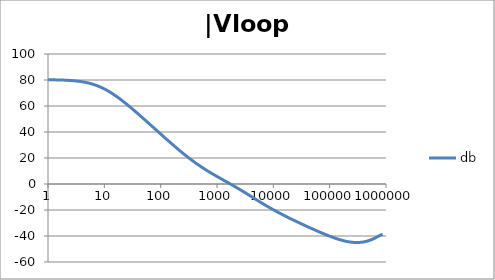
| Category | db |
|---|---|
| 1.0 | 80.192 |
| 1.0715193052376064 | 80.176 |
| 1.1481536214968828 | 80.157 |
| 1.2302687708123814 | 80.135 |
| 1.318256738556407 | 80.11 |
| 1.4125375446227544 | 80.081 |
| 1.513561248436208 | 80.049 |
| 1.6218100973589298 | 80.011 |
| 1.7378008287493754 | 79.969 |
| 1.8620871366628673 | 79.92 |
| 1.9952623149688797 | 79.864 |
| 2.1379620895022318 | 79.801 |
| 2.2908676527677727 | 79.729 |
| 2.45470891568503 | 79.647 |
| 2.6302679918953817 | 79.553 |
| 2.8183829312644537 | 79.448 |
| 3.0199517204020156 | 79.328 |
| 3.235936569296282 | 79.193 |
| 3.467368504525316 | 79.04 |
| 3.7153522909717256 | 78.868 |
| 3.9810717055349727 | 78.675 |
| 4.265795188015926 | 78.459 |
| 4.570881896148749 | 78.218 |
| 4.897788193684462 | 77.95 |
| 5.2480746024977245 | 77.652 |
| 5.62341325190349 | 77.322 |
| 6.025595860743575 | 76.96 |
| 6.456542290346554 | 76.562 |
| 6.918309709189363 | 76.127 |
| 7.4131024130091765 | 75.654 |
| 7.943282347242814 | 75.142 |
| 8.511380382023765 | 74.59 |
| 9.120108393559095 | 73.998 |
| 9.772372209558105 | 73.365 |
| 10.47128548050899 | 72.692 |
| 11.22018454301963 | 71.98 |
| 12.022644346174127 | 71.229 |
| 12.88249551693134 | 70.44 |
| 13.803842646028851 | 69.616 |
| 14.791083881682074 | 68.758 |
| 15.848931924611136 | 67.868 |
| 16.98243652461744 | 66.948 |
| 18.197008586099834 | 66 |
| 19.498445997580447 | 65.026 |
| 20.892961308540382 | 64.028 |
| 22.387211385683386 | 63.009 |
| 23.988329190194897 | 61.97 |
| 25.703957827688622 | 60.913 |
| 27.54228703338165 | 59.841 |
| 29.51209226666385 | 58.754 |
| 31.62277660168379 | 57.654 |
| 33.884415613920254 | 56.543 |
| 36.307805477010106 | 55.422 |
| 38.90451449942804 | 54.293 |
| 41.686938347033525 | 53.156 |
| 44.6683592150963 | 52.013 |
| 47.86300923226381 | 50.864 |
| 51.28613839913647 | 49.71 |
| 54.95408738576247 | 48.553 |
| 58.88436553555889 | 47.392 |
| 63.09573444801931 | 46.229 |
| 67.60829753919813 | 45.065 |
| 72.44359600749901 | 43.899 |
| 77.62471166286915 | 42.733 |
| 83.17637711026705 | 41.566 |
| 89.12509381337456 | 40.401 |
| 95.49925860214357 | 39.237 |
| 102.32929922807544 | 38.075 |
| 109.64781961431841 | 36.915 |
| 117.48975549395293 | 35.758 |
| 125.89254117941665 | 34.606 |
| 134.89628825916537 | 33.458 |
| 144.54397707459273 | 32.316 |
| 154.88166189124806 | 31.18 |
| 165.95869074375608 | 30.051 |
| 177.82794100389225 | 28.93 |
| 190.5460717963248 | 27.819 |
| 204.17379446695278 | 26.718 |
| 218.77616239495524 | 25.628 |
| 234.42288153199212 | 24.55 |
| 251.18864315095806 | 23.486 |
| 269.15348039269156 | 22.436 |
| 288.4031503126605 | 21.402 |
| 309.0295432513591 | 20.385 |
| 331.1311214825911 | 19.384 |
| 354.81338923357566 | 18.402 |
| 380.18939632056095 | 17.439 |
| 407.3802778041123 | 16.495 |
| 436.5158322401654 | 15.57 |
| 467.7351412871979 | 14.665 |
| 501.18723362727184 | 13.779 |
| 537.0317963702526 | 12.911 |
| 575.4399373371566 | 12.062 |
| 616.5950018614822 | 11.231 |
| 660.6934480075952 | 10.416 |
| 707.9457843841375 | 9.616 |
| 758.5775750291831 | 8.829 |
| 812.8305161640983 | 8.056 |
| 870.9635899560801 | 7.294 |
| 933.2543007969903 | 6.541 |
| 999.9999999999998 | 5.796 |
| 1071.5193052376057 | 5.057 |
| 1148.1536214968828 | 4.323 |
| 1230.2687708123801 | 3.593 |
| 1318.2567385564053 | 2.864 |
| 1412.537544622753 | 2.135 |
| 1513.5612484362066 | 1.405 |
| 1621.8100973589292 | 0.673 |
| 1737.8008287493742 | -0.064 |
| 1862.0871366628671 | -0.805 |
| 1995.2623149688786 | -1.552 |
| 2137.9620895022326 | -2.305 |
| 2290.867652767771 | -3.066 |
| 2454.708915685027 | -3.834 |
| 2630.26799189538 | -4.61 |
| 2818.382931264451 | -5.394 |
| 3019.9517204020176 | -6.184 |
| 3235.9365692962774 | -6.982 |
| 3467.368504525316 | -7.784 |
| 3715.352290971724 | -8.592 |
| 3981.07170553497 | -9.402 |
| 4265.795188015923 | -10.214 |
| 4570.881896148745 | -11.027 |
| 4897.788193684463 | -11.837 |
| 5248.074602497726 | -12.645 |
| 5623.413251903489 | -13.448 |
| 6025.595860743574 | -14.245 |
| 6456.54229034655 | -15.034 |
| 6918.309709189357 | -15.815 |
| 7413.102413009165 | -16.587 |
| 7943.282347242815 | -17.349 |
| 8511.380382023763 | -18.1 |
| 9120.108393559092 | -18.84 |
| 9772.3722095581 | -19.569 |
| 10471.285480509003 | -20.288 |
| 11220.184543019639 | -20.996 |
| 12022.64434617411 | -21.694 |
| 12882.495516931338 | -22.382 |
| 13803.842646028841 | -23.061 |
| 14791.083881682063 | -23.732 |
| 15848.931924611119 | -24.395 |
| 16982.436524617453 | -25.05 |
| 18197.008586099837 | -25.698 |
| 19498.445997580417 | -26.341 |
| 20892.961308540387 | -26.977 |
| 22387.211385683382 | -27.608 |
| 23988.32919019488 | -28.234 |
| 25703.957827688606 | -28.855 |
| 27542.28703338167 | -29.472 |
| 29512.092266663854 | -30.085 |
| 31622.77660168378 | -30.694 |
| 33884.41561392023 | -31.299 |
| 36307.805477010166 | -31.9 |
| 38904.514499428085 | -32.497 |
| 41686.93834703348 | -33.091 |
| 44668.35921509631 | -33.681 |
| 47863.00923226382 | -34.266 |
| 51286.13839913646 | -34.848 |
| 54954.08738576241 | -35.424 |
| 58884.365535558936 | -35.995 |
| 63095.73444801934 | -36.561 |
| 67608.29753919817 | -37.12 |
| 72443.59600749899 | -37.672 |
| 77624.71166286913 | -38.217 |
| 83176.37711026703 | -38.753 |
| 89125.09381337445 | -39.279 |
| 95499.25860214363 | -39.794 |
| 102329.29922807543 | -40.296 |
| 109647.81961431848 | -40.785 |
| 117489.75549395289 | -41.259 |
| 125892.54117941685 | -41.715 |
| 134896.28825916522 | -42.153 |
| 144543.97707459255 | -42.568 |
| 154881.66189124787 | -42.961 |
| 165958.69074375575 | -43.327 |
| 177827.9410038922 | -43.665 |
| 190546.07179632425 | -43.971 |
| 204173.79446695274 | -44.244 |
| 218776.16239495497 | -44.479 |
| 234422.88153199226 | -44.675 |
| 251188.64315095753 | -44.829 |
| 269153.480392691 | -44.937 |
| 288403.15031266044 | -44.997 |
| 309029.5432513582 | -45.007 |
| 331131.1214825907 | -44.963 |
| 354813.3892335749 | -44.865 |
| 380189.3963205612 | -44.708 |
| 407380.2778041119 | -44.493 |
| 436515.8322401649 | -44.216 |
| 467735.14128719777 | -43.876 |
| 501187.2336272717 | -43.472 |
| 537031.7963702519 | -43.004 |
| 575439.9373371559 | -42.471 |
| 616595.001861482 | -41.877 |
| 660693.4480075944 | -41.229 |
| 707945.7843841374 | -40.542 |
| 758577.575029183 | -39.846 |
| 812830.5161640996 | -39.189 |
| 870963.5899560791 | -38.647 |